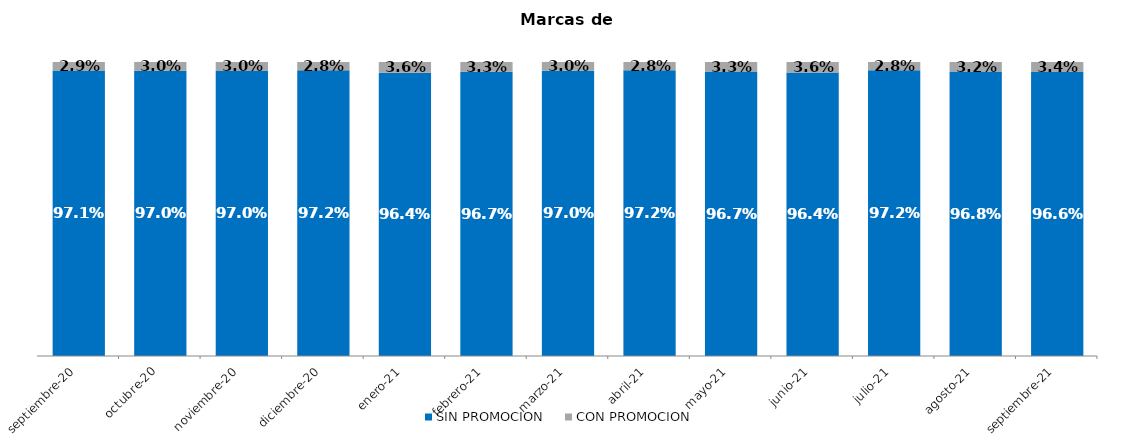
| Category | SIN PROMOCION   | CON PROMOCION   |
|---|---|---|
| 2020-09-01 | 0.971 | 0.029 |
| 2020-10-01 | 0.97 | 0.03 |
| 2020-11-01 | 0.97 | 0.03 |
| 2020-12-01 | 0.972 | 0.028 |
| 2021-01-01 | 0.964 | 0.036 |
| 2021-02-01 | 0.967 | 0.033 |
| 2021-03-01 | 0.97 | 0.03 |
| 2021-04-01 | 0.972 | 0.028 |
| 2021-05-01 | 0.967 | 0.033 |
| 2021-06-01 | 0.964 | 0.036 |
| 2021-07-01 | 0.972 | 0.028 |
| 2021-08-01 | 0.968 | 0.032 |
| 2021-09-01 | 0.966 | 0.034 |